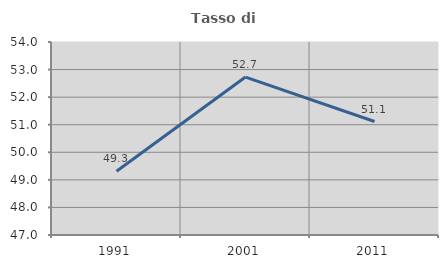
| Category | Tasso di occupazione   |
|---|---|
| 1991.0 | 49.315 |
| 2001.0 | 52.729 |
| 2011.0 | 51.116 |